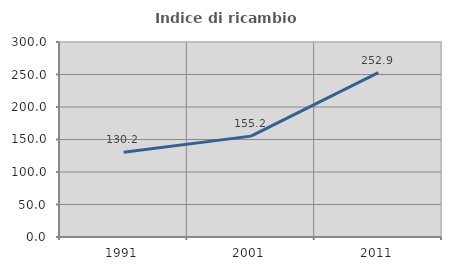
| Category | Indice di ricambio occupazionale  |
|---|---|
| 1991.0 | 130.247 |
| 2001.0 | 155.184 |
| 2011.0 | 252.886 |